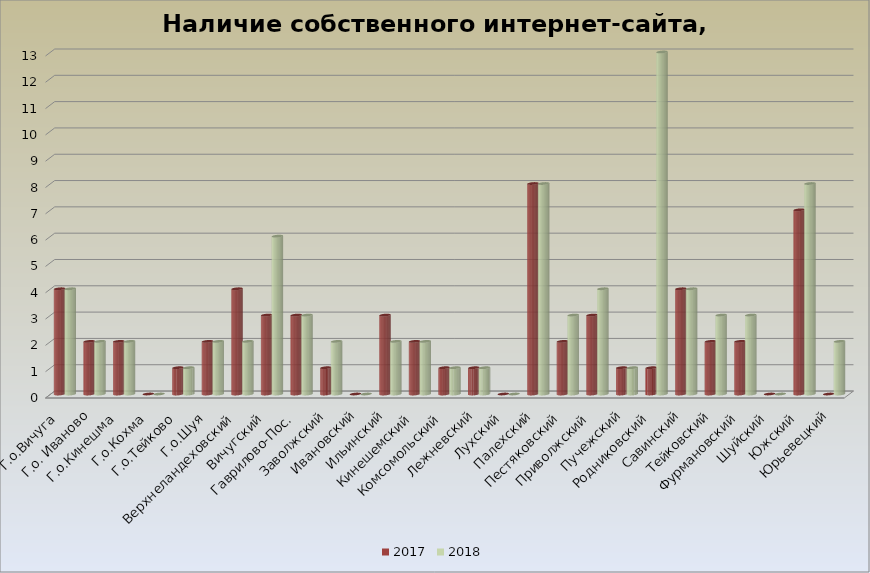
| Category | 2017 | Series 2 | Series 3 | Series 4 | Series 5 | Series 6 | Series 7 | Series 8 | Series 9 | Series 10 | Series 11 | Series 12 | Series 13 | 2018 |
|---|---|---|---|---|---|---|---|---|---|---|---|---|---|---|
| Г.о.Вичуга | 4 |  |  |  |  |  |  |  |  |  |  |  |  | 4 |
| Г.о. Иваново | 2 |  |  |  |  |  |  |  |  |  |  |  |  | 2 |
| Г.о.Кинешма | 2 |  |  |  |  |  |  |  |  |  |  |  |  | 2 |
| Г.о.Кохма | 0 |  |  |  |  |  |  |  |  |  |  |  |  | 0 |
| Г.о.Тейково | 1 |  |  |  |  |  |  |  |  |  |  |  |  | 1 |
| Г.о.Шуя | 2 |  |  |  |  |  |  |  |  |  |  |  |  | 2 |
| Верхнеландеховский | 4 |  |  |  |  |  |  |  |  |  |  |  |  | 2 |
| Вичугский | 3 |  |  |  |  |  |  |  |  |  |  |  |  | 6 |
| Гаврилово-Пос. | 3 |  |  |  |  |  |  |  |  |  |  |  |  | 3 |
| Заволжский | 1 |  |  |  |  |  |  |  |  |  |  |  |  | 2 |
| Ивановский | 0 |  |  |  |  |  |  |  |  |  |  |  |  | 0 |
| Ильинский | 3 |  |  |  |  |  |  |  |  |  |  |  |  | 2 |
| Кинешемский | 2 |  |  |  |  |  |  |  |  |  |  |  |  | 2 |
| Комсомольский | 1 |  |  |  |  |  |  |  |  |  |  |  |  | 1 |
| Лежневский | 1 |  |  |  |  |  |  |  |  |  |  |  |  | 1 |
| Лухский | 0 |  |  |  |  |  |  |  |  |  |  |  |  | 0 |
| Палехский | 8 |  |  |  |  |  |  |  |  |  |  |  |  | 8 |
| Пестяковский | 2 |  |  |  |  |  |  |  |  |  |  |  |  | 3 |
| Приволжский | 3 |  |  |  |  |  |  |  |  |  |  |  |  | 4 |
| Пучежский | 1 |  |  |  |  |  |  |  |  |  |  |  |  | 1 |
| Родниковский | 1 |  |  |  |  |  |  |  |  |  |  |  |  | 13 |
| Савинский | 4 |  |  |  |  |  |  |  |  |  |  |  |  | 4 |
| Тейковский | 2 |  |  |  |  |  |  |  |  |  |  |  |  | 3 |
| Фурмановский | 2 |  |  |  |  |  |  |  |  |  |  |  |  | 3 |
| Шуйский | 0 |  |  |  |  |  |  |  |  |  |  |  |  | 0 |
| Южский | 7 |  |  |  |  |  |  |  |  |  |  |  |  | 8 |
| Юрьевецкий | 0 |  |  |  |  |  |  |  |  |  |  |  |  | 2 |